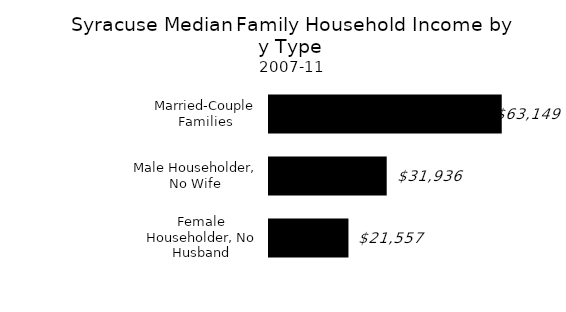
| Category | Series 0 |
|---|---|
| Female Householder, No Husband | 21557 |
| Male Householder, No Wife | 31936 |
| Married-Couple Families | 63149 |